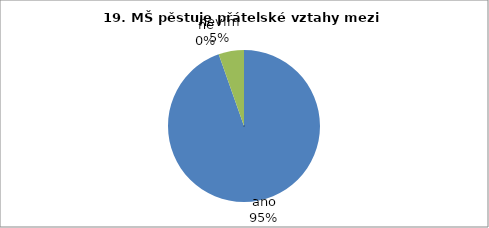
| Category | 19. MŠ pěstuje přátelské vztahy mezi dětmi. |
|---|---|
| ano | 35 |
| ne | 0 |
| nevím | 2 |